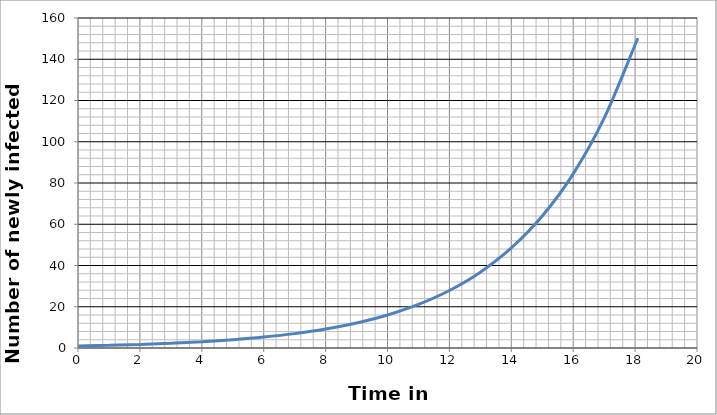
| Category | Series 0 |
|---|---|
| 0.0 | 1 |
| 1.0 | 1.32 |
| 2.0 | 1.741 |
| 3.0 | 2.297 |
| 4.0 | 3.031 |
| 5.0 | 4 |
| 6.0 | 5.278 |
| 7.0 | 6.964 |
| 8.0 | 9.19 |
| 9.0 | 12.126 |
| 10.0 | 16 |
| 11.0 | 21.112 |
| 12.0 | 27.858 |
| 13.0 | 36.758 |
| 14.0 | 48.503 |
| 15.0 | 64 |
| 16.0 | 84.449 |
| 17.0 | 111.43 |
| 18.0 | 147.033 |
| 18.0 | 147.033 |
| 18.0 | 147.033 |
| 18.0 | 147.033 |
| 18.0 | 147.033 |
| 18.0 | 147.033 |
| 18.0 | 147.033 |
| 18.0 | 147.033 |
| 18.0 | 147.033 |
| 18.0 | 147.033 |
| 18.0 | 147.033 |
| 18.0 | 147.033 |
| 18.0 | 147.033 |
| 18.0 | 147.033 |
| 18.0 | 147.033 |
| 18.0 | 147.033 |
| 18.0 | 147.033 |
| 18.0 | 147.033 |
| 18.0 | 147.033 |
| 18.0 | 147.033 |
| 18.0 | 147.033 |
| 18.0 | 147.033 |
| 18.0 | 147.033 |
| 18.0 | 147.033 |
| 18.0 | 147.033 |
| 18.0 | 147.033 |
| 18.0 | 147.033 |
| 18.0 | 147.033 |
| 18.0 | 147.033 |
| 18.0 | 147.033 |
| 18.0 | 147.033 |
| 18.0 | 147.033 |
| 18.0 | 147.033 |
| 18.0 | 147.033 |
| 18.0 | 147.033 |
| 18.0 | 147.033 |
| 18.0 | 147.033 |
| 18.0 | 147.033 |
| 18.0 | 147.033 |
| 18.0 | 147.033 |
| 18.0 | 147.033 |
| 18.0 | 147.033 |
| 18.0 | 147.033 |
| 18.0 | 147.033 |
| 18.0 | 147.033 |
| 18.0 | 147.033 |
| 18.0 | 147.033 |
| 18.0 | 147.033 |
| 18.0 | 147.033 |
| 18.0 | 147.033 |
| 18.0 | 147.033 |
| 18.0 | 147.033 |
| 18.0 | 147.033 |
| 18.0 | 147.033 |
| 18.0 | 147.033 |
| 18.0 | 147.033 |
| 18.0 | 147.033 |
| 18.0 | 147.033 |
| 18.0 | 147.033 |
| 18.0 | 147.033 |
| 18.0 | 147.033 |
| 18.0 | 147.033 |
| 18.0 | 147.033 |
| 18.0 | 147.033 |
| 18.0 | 147.033 |
| 18.0 | 147.033 |
| 18.0 | 147.033 |
| 18.0 | 147.033 |
| 18.0 | 147.033 |
| 18.0 | 147.033 |
| 18.0 | 147.033 |
| 18.0 | 147.033 |
| 18.0 | 147.033 |
| 18.0 | 147.033 |
| 18.0 | 147.033 |
| 18.0 | 147.033 |
| 18.0 | 147.033 |
| 18.0 | 147.033 |
| 18.0 | 147.033 |
| 18.0 | 147.033 |
| 18.0 | 147.033 |
| 18.0 | 147.033 |
| 18.0 | 147.033 |
| 18.0 | 147.033 |
| 18.0 | 147.033 |
| 18.0 | 147.033 |
| 18.0 | 147.033 |
| 18.0 | 147.033 |
| 18.0 | 147.033 |
| 18.0 | 147.033 |
| 18.0 | 147.033 |
| 18.0 | 147.033 |
| 18.0 | 147.033 |
| 18.0 | 147.033 |
| 18.0 | 147.033 |
| 18.0 | 147.033 |
| 18.0 | 147.033 |
| 18.0 | 147.033 |
| 18.0 | 147.033 |
| 18.0 | 147.033 |
| 18.0 | 147.033 |
| 18.0 | 147.033 |
| 18.0 | 147.033 |
| 18.0 | 147.033 |
| 18.0 | 147.033 |
| 18.0 | 147.033 |
| 18.0 | 147.033 |
| 18.0 | 147.033 |
| 18.0 | 147.033 |
| 18.0 | 147.033 |
| 18.0 | 147.033 |
| 18.0 | 147.033 |
| 18.0 | 147.033 |
| 18.0 | 147.033 |
| 18.0 | 147.033 |
| 18.0 | 147.033 |
| 18.0 | 147.033 |
| 18.0 | 147.033 |
| 18.0 | 147.033 |
| 18.0 | 147.033 |
| 18.0 | 147.033 |
| 18.0 | 147.033 |
| 18.0 | 147.033 |
| 18.0 | 147.033 |
| 18.0 | 147.033 |
| 18.0 | 147.033 |
| 18.0 | 147.033 |
| 18.0 | 147.033 |
| 18.0 | 147.033 |
| 18.0 | 147.033 |
| 18.0 | 147.033 |
| 18.0 | 147.033 |
| 18.0 | 147.033 |
| 18.0 | 147.033 |
| 18.0 | 147.033 |
| 18.0 | 147.033 |
| 18.0 | 147.033 |
| 18.0 | 147.033 |
| 18.0 | 147.033 |
| 18.0 | 147.033 |
| 18.0 | 147.033 |
| 18.0 | 147.033 |
| 18.0 | 147.033 |
| 18.0 | 147.033 |
| 18.0 | 147.033 |
| 18.0 | 147.033 |
| 18.0 | 147.033 |
| 18.0 | 147.033 |
| 18.0 | 147.033 |
| 18.0 | 147.033 |
| 18.0 | 147.033 |
| 18.0 | 147.033 |
| 18.0 | 147.033 |
| 18.0 | 147.033 |
| 18.0 | 147.033 |
| 18.0 | 147.033 |
| 18.0 | 147.033 |
| 18.0 | 147.033 |
| 18.0 | 147.033 |
| 18.0 | 147.033 |
| 18.0 | 147.033 |
| 18.0 | 147.033 |
| 18.0 | 147.033 |
| 18.0 | 147.033 |
| 18.0 | 147.033 |
| 18.0 | 147.033 |
| 18.0 | 147.033 |
| 18.0 | 147.033 |
| 18.0 | 147.033 |
| 18.0 | 147.033 |
| 18.0 | 147.033 |
| 18.0 | 147.033 |
| 18.0 | 147.033 |
| 18.0 | 147.033 |
| 18.0 | 147.033 |
| 18.0 | 147.033 |
| 18.0 | 147.033 |
| 18.0 | 147.033 |
| 18.0 | 147.033 |
| 18.0 | 147.033 |
| 18.0 | 147.033 |
| 18.0 | 147.033 |
| 18.0 | 147.033 |
| 18.0 | 147.033 |
| 18.0 | 147.033 |
| 18.0 | 147.033 |
| 18.0 | 147.033 |
| 18.0 | 147.033 |
| 18.0 | 147.033 |
| 18.0 | 147.033 |
| 18.0 | 147.033 |
| 18.0 | 147.033 |
| 18.0 | 147.033 |
| 18.0 | 147.033 |
| 18.0 | 147.033 |
| 18.0 | 147.033 |
| 18.0 | 147.033 |
| 18.0 | 147.033 |
| 18.0 | 147.033 |
| 18.0 | 147.033 |
| 18.0 | 147.033 |
| 18.0 | 147.033 |
| 18.0 | 147.033 |
| 18.0 | 147.033 |
| 18.0 | 147.033 |
| 18.0 | 147.033 |
| 18.0 | 147.033 |
| 18.0 | 147.033 |
| 18.0 | 147.033 |
| 18.0 | 147.033 |
| 18.0 | 147.033 |
| 18.0 | 147.033 |
| 18.0 | 147.033 |
| 18.0 | 147.033 |
| 18.0 | 147.033 |
| 18.0 | 147.033 |
| 18.0 | 147.033 |
| 18.0 | 147.033 |
| 18.0 | 147.033 |
| 18.0 | 147.033 |
| 18.0 | 147.033 |
| 18.0 | 147.033 |
| 18.0 | 147.033 |
| 18.0 | 147.033 |
| 18.0 | 147.033 |
| 18.0 | 147.033 |
| 18.0 | 147.033 |
| 18.0 | 147.033 |
| 18.0 | 147.033 |
| 18.0 | 147.033 |
| 18.0 | 147.033 |
| 18.0 | 147.033 |
| 18.0 | 147.033 |
| 18.0 | 147.033 |
| 18.0 | 147.033 |
| 18.0 | 147.033 |
| 18.0 | 147.033 |
| 18.0 | 147.033 |
| 18.0 | 147.033 |
| 18.0 | 147.033 |
| 18.0 | 147.033 |
| 18.0 | 147.033 |
| 18.0 | 147.033 |
| 18.0 | 147.033 |
| 18.0 | 147.033 |
| 18.0 | 147.033 |
| 18.0 | 147.033 |
| 18.0 | 147.033 |
| 18.0 | 147.033 |
| 18.0 | 147.033 |
| 18.0 | 147.033 |
| 18.0 | 147.033 |
| 18.0 | 147.033 |
| 18.0 | 147.033 |
| 18.0 | 147.033 |
| 18.0 | 147.033 |
| 18.0 | 147.033 |
| 18.0 | 147.033 |
| 18.0 | 147.033 |
| 18.0 | 147.033 |
| 18.0 | 147.033 |
| 18.0 | 147.033 |
| 18.0 | 147.033 |
| 18.0 | 147.033 |
| 18.0 | 147.033 |
| 18.0 | 147.033 |
| 18.0 | 147.033 |
| 18.0 | 147.033 |
| 18.0 | 147.033 |
| 18.0 | 147.033 |
| 18.0 | 147.033 |
| 18.0 | 147.033 |
| 18.0 | 147.033 |
| 18.0 | 147.033 |
| 18.0 | 147.033 |
| 18.0 | 147.033 |
| 18.0 | 147.033 |
| 18.0 | 147.033 |
| 18.0 | 147.033 |
| 18.0 | 147.033 |
| 18.0 | 147.033 |
| 18.0 | 147.033 |
| 18.0 | 147.033 |
| 18.0 | 147.033 |
| 18.0 | 147.033 |
| 18.0 | 147.033 |
| 18.0 | 147.033 |
| 18.0 | 147.033 |
| 18.0 | 147.033 |
| 18.0 | 147.033 |
| 18.0 | 147.033 |
| 18.0 | 147.033 |
| 18.0 | 147.033 |
| 18.0 | 147.033 |
| 18.0 | 147.033 |
| 18.0 | 147.033 |
| 18.0 | 147.033 |
| 18.0 | 147.033 |
| 18.0 | 147.033 |
| 18.0 | 147.033 |
| 18.0 | 147.033 |
| 18.0 | 147.033 |
| 18.0 | 147.033 |
| 18.0 | 147.033 |
| 18.0 | 147.033 |
| 18.0 | 147.033 |
| 18.0 | 147.033 |
| 18.0 | 147.033 |
| 18.0 | 147.033 |
| 18.0 | 147.033 |
| 18.0 | 147.033 |
| 18.0 | 147.033 |
| 18.0 | 147.033 |
| 18.0 | 147.033 |
| 18.0 | 147.033 |
| 18.0 | 147.033 |
| 18.0 | 147.033 |
| 18.0 | 147.033 |
| 18.0 | 147.033 |
| 18.0 | 147.033 |
| 18.0 | 147.033 |
| 18.0 | 147.033 |
| 18.0 | 147.033 |
| 18.0 | 147.033 |
| 18.0 | 147.033 |
| 18.0 | 147.033 |
| 18.0 | 147.033 |
| 18.0 | 147.033 |
| 18.0 | 147.033 |
| 18.0 | 147.033 |
| 18.0 | 147.033 |
| 18.0 | 147.033 |
| 18.0 | 147.033 |
| 18.0 | 147.033 |
| 18.0 | 147.033 |
| 18.0 | 147.033 |
| 18.0 | 147.033 |
| 18.0 | 147.033 |
| 18.0 | 147.033 |
| 18.0 | 147.033 |
| 18.0 | 147.033 |
| 18.0 | 147.033 |
| 18.0 | 147.033 |
| 18.0 | 147.033 |
| 18.0 | 147.033 |
| 18.0 | 147.033 |
| 18.0 | 147.033 |
| 18.0 | 147.033 |
| 18.0 | 147.033 |
| 18.0 | 147.033 |
| 18.0 | 147.033 |
| 18.0 | 147.033 |
| 18.0 | 147.033 |
| 18.0 | 147.033 |
| 18.0 | 147.033 |
| 18.0 | 147.033 |
| 18.0 | 147.033 |
| 18.0 | 147.033 |
| 18.0 | 147.033 |
| 18.0 | 147.033 |
| 18.0 | 147.033 |
| 18.0 | 147.033 |
| 18.0 | 147.033 |
| 18.0 | 147.033 |
| 18.0 | 147.033 |
| 18.0 | 147.033 |
| 18.0 | 147.033 |
| 18.0 | 147.033 |
| 18.0 | 147.033 |
| 18.0 | 147.033 |
| 18.0 | 147.033 |
| 18.0 | 147.033 |
| 18.0 | 147.033 |
| 18.0 | 147.033 |
| 18.0 | 147.033 |
| 18.0 | 147.033 |
| 18.0 | 147.033 |
| 18.0 | 147.033 |
| 18.0 | 147.033 |
| 18.0 | 147.033 |
| 18.0 | 147.033 |
| 18.0 | 147.033 |
| 18.0 | 147.033 |
| 18.0 | 147.033 |
| 18.0 | 147.033 |
| 18.0 | 147.033 |
| 18.0 | 147.033 |
| 18.0 | 147.033 |
| 18.0 | 147.033 |
| 18.0 | 147.033 |
| 18.0 | 147.033 |
| 18.0 | 147.033 |
| 18.0 | 147.033 |
| 18.0 | 147.033 |
| 18.0 | 147.033 |
| 18.0 | 147.033 |
| 18.0 | 147.033 |
| 18.0 | 147.033 |
| 18.0 | 147.033 |
| 18.0 | 147.033 |
| 18.0 | 147.033 |
| 18.0 | 147.033 |
| 18.0 | 147.033 |
| 18.0 | 147.033 |
| 18.0 | 147.033 |
| 18.0 | 147.033 |
| 18.0 | 147.033 |
| 18.0 | 147.033 |
| 18.0 | 147.033 |
| 18.0 | 147.033 |
| 18.0 | 147.033 |
| 18.0 | 147.033 |
| 18.0 | 147.033 |
| 18.0 | 147.033 |
| 18.0 | 147.033 |
| 18.0 | 147.033 |
| 18.0 | 147.033 |
| 18.0 | 147.033 |
| 18.0 | 147.033 |
| 18.0 | 147.033 |
| 18.0 | 147.033 |
| 18.0 | 147.033 |
| 18.0 | 147.033 |
| 18.0 | 147.033 |
| 18.0 | 147.033 |
| 18.0 | 147.033 |
| 18.0 | 147.033 |
| 18.0 | 147.033 |
| 18.0 | 147.033 |
| 18.0 | 147.033 |
| 18.0 | 147.033 |
| 18.0 | 147.033 |
| 18.0 | 147.033 |
| 18.0 | 147.033 |
| 18.0 | 147.033 |
| 18.0 | 147.033 |
| 18.0 | 147.033 |
| 18.0 | 147.033 |
| 18.0 | 147.033 |
| 18.0 | 147.033 |
| 18.0 | 147.033 |
| 18.0 | 147.033 |
| 18.0 | 147.033 |
| 18.0 | 147.033 |
| 18.0 | 147.033 |
| 18.0 | 147.033 |
| 18.0 | 147.033 |
| 18.0 | 147.033 |
| 18.0 | 147.033 |
| 18.0 | 147.033 |
| 18.0 | 147.033 |
| 18.0 | 147.033 |
| 18.0 | 147.033 |
| 18.0 | 147.033 |
| 18.0 | 147.033 |
| 18.0 | 147.033 |
| 18.0 | 147.033 |
| 18.0 | 147.033 |
| 18.0 | 147.033 |
| 18.0 | 147.033 |
| 18.0 | 147.033 |
| 18.0 | 147.033 |
| 18.0 | 147.033 |
| 18.0 | 147.033 |
| 18.0 | 147.033 |
| 18.0 | 147.033 |
| 18.0 | 147.033 |
| 18.0 | 147.033 |
| 18.0 | 147.033 |
| 18.0 | 147.033 |
| 18.0 | 147.033 |
| 18.0 | 147.033 |
| 18.0 | 147.033 |
| 18.0 | 147.033 |
| 18.0 | 147.033 |
| 18.0 | 147.033 |
| 18.0 | 147.033 |
| 18.0 | 147.033 |
| 18.0 | 147.033 |
| 18.0 | 147.033 |
| 18.0 | 147.033 |
| 18.0 | 147.033 |
| 18.0 | 147.033 |
| 18.0 | 147.033 |
| 18.0 | 147.033 |
| 18.0 | 147.033 |
| 18.0 | 147.033 |
| 18.0 | 147.033 |
| 18.0 | 147.033 |
| 18.0 | 147.033 |
| 18.0 | 147.033 |
| 18.0 | 147.033 |
| 18.0 | 147.033 |
| 18.0 | 147.033 |
| 18.0 | 147.033 |
| 18.0 | 147.033 |
| 18.0 | 147.033 |
| 18.0 | 147.033 |
| 18.0 | 147.033 |
| 18.0 | 147.033 |
| 18.0 | 147.033 |
| 18.0 | 147.033 |
| 18.0 | 147.033 |
| 18.0 | 147.033 |
| 18.0 | 147.033 |
| 18.0 | 147.033 |
| 18.0 | 147.033 |
| 18.0 | 147.033 |
| 18.0 | 147.033 |
| 18.0 | 147.033 |
| 18.0 | 147.033 |
| 18.0 | 147.033 |
| 18.0 | 147.033 |
| 18.0 | 147.033 |
| 18.0 | 147.033 |
| 18.0 | 147.033 |
| 18.0 | 147.033 |
| 18.0 | 147.033 |
| 18.0 | 147.033 |
| 18.0 | 147.033 |
| 18.0 | 147.033 |
| 18.0 | 147.033 |
| 18.0 | 147.033 |
| 18.0 | 147.033 |
| 18.0 | 147.033 |
| 18.0 | 147.033 |
| 18.0 | 147.033 |
| 18.0 | 147.033 |
| 18.0 | 147.033 |
| 18.0 | 147.033 |
| 18.0 | 147.033 |
| 18.0 | 147.033 |
| 18.0 | 147.033 |
| 18.0 | 147.033 |
| 18.0 | 147.033 |
| 18.0 | 147.033 |
| 18.0 | 147.033 |
| 18.0 | 147.033 |
| 18.0 | 147.033 |
| 18.0 | 147.033 |
| 18.0 | 147.033 |
| 18.0 | 147.033 |
| 18.0 | 147.033 |
| 18.0 | 147.033 |
| 18.0 | 147.033 |
| 18.0 | 147.033 |
| 18.0 | 147.033 |
| 18.0 | 147.033 |
| 18.0 | 147.033 |
| 18.0 | 147.033 |
| 18.0 | 147.033 |
| 18.0 | 147.033 |
| 18.0 | 147.033 |
| 18.0 | 147.033 |
| 18.0 | 147.033 |
| 18.0 | 147.033 |
| 18.0 | 147.033 |
| 18.0 | 147.033 |
| 18.0 | 147.033 |
| 18.0 | 147.033 |
| 18.0 | 147.033 |
| 18.0 | 147.033 |
| 18.0 | 147.033 |
| 18.0 | 147.033 |
| 18.0 | 147.033 |
| 18.0 | 147.033 |
| 18.0 | 147.033 |
| 18.0 | 147.033 |
| 18.0 | 147.033 |
| 18.0 | 147.033 |
| 18.0 | 147.033 |
| 18.0 | 147.033 |
| 18.0 | 147.033 |
| 18.0 | 147.033 |
| 18.0 | 147.033 |
| 18.0 | 147.033 |
| 18.0 | 147.033 |
| 18.0 | 147.033 |
| 18.0 | 147.033 |
| 18.0 | 147.033 |
| 18.0 | 147.033 |
| 18.0 | 147.033 |
| 18.0 | 147.033 |
| 18.0 | 147.033 |
| 18.0 | 147.033 |
| 18.0 | 147.033 |
| 18.0 | 147.033 |
| 18.0 | 147.033 |
| 18.0 | 147.033 |
| 18.0 | 147.033 |
| 18.0 | 147.033 |
| 18.0 | 147.033 |
| 18.0 | 147.033 |
| 18.0 | 147.033 |
| 18.0 | 147.033 |
| 18.0 | 147.033 |
| 18.0 | 147.033 |
| 18.0 | 147.033 |
| 18.0 | 147.033 |
| 18.0 | 147.033 |
| 18.0 | 147.033 |
| 18.0 | 147.033 |
| 18.0 | 147.033 |
| 18.0 | 147.033 |
| 18.0 | 147.033 |
| 18.0 | 147.033 |
| 18.0 | 147.033 |
| 18.0 | 147.033 |
| 18.0 | 147.033 |
| 18.0 | 147.033 |
| 18.0 | 147.033 |
| 18.0 | 147.033 |
| 18.0 | 147.033 |
| 18.0 | 147.033 |
| 18.0 | 147.033 |
| 18.0 | 147.033 |
| 18.0 | 147.033 |
| 18.0 | 147.033 |
| 18.0 | 147.033 |
| 18.0 | 147.033 |
| 18.0 | 147.033 |
| 18.0 | 147.033 |
| 18.0 | 147.033 |
| 18.0 | 147.033 |
| 18.0 | 147.033 |
| 18.0 | 147.033 |
| 18.0 | 147.033 |
| 18.0 | 147.033 |
| 18.0 | 147.033 |
| 18.0 | 147.033 |
| 18.0 | 147.033 |
| 18.0 | 147.033 |
| 18.0 | 147.033 |
| 18.0 | 147.033 |
| 18.0 | 147.033 |
| 18.0 | 147.033 |
| 18.0 | 147.033 |
| 18.0 | 147.033 |
| 18.0 | 147.033 |
| 18.0 | 147.033 |
| 18.0 | 147.033 |
| 18.0 | 147.033 |
| 18.0 | 147.033 |
| 18.0 | 147.033 |
| 18.0 | 147.033 |
| 18.0 | 147.033 |
| 18.0 | 147.033 |
| 18.0 | 147.033 |
| 18.0 | 147.033 |
| 18.0 | 147.033 |
| 18.0 | 147.033 |
| 18.0 | 147.033 |
| 18.0 | 147.033 |
| 18.0 | 147.033 |
| 18.0 | 147.033 |
| 18.0 | 147.033 |
| 18.0 | 147.033 |
| 18.0 | 147.033 |
| 18.0 | 147.033 |
| 18.0 | 147.033 |
| 18.0 | 147.033 |
| 18.0 | 147.033 |
| 18.0 | 147.033 |
| 18.0 | 147.033 |
| 18.0 | 147.033 |
| 18.0 | 147.033 |
| 18.0 | 147.033 |
| 18.0 | 147.033 |
| 18.0 | 147.033 |
| 18.0 | 147.033 |
| 18.0 | 147.033 |
| 18.0 | 147.033 |
| 18.0 | 147.033 |
| 18.0 | 147.033 |
| 18.0 | 147.033 |
| 18.0 | 147.033 |
| 18.0 | 147.033 |
| 18.0 | 147.033 |
| 18.0 | 147.033 |
| 18.0 | 147.033 |
| 18.0 | 147.033 |
| 18.0 | 147.033 |
| 18.0 | 147.033 |
| 18.0 | 147.033 |
| 18.0 | 147.033 |
| 18.0 | 147.033 |
| 18.0 | 147.033 |
| 18.0 | 147.033 |
| 18.0 | 147.033 |
| 18.0 | 147.033 |
| 18.0 | 147.033 |
| 18.0 | 147.033 |
| 18.0 | 147.033 |
| 18.0 | 147.033 |
| 18.0 | 147.033 |
| 18.0 | 147.033 |
| 18.0 | 147.033 |
| 18.0 | 147.033 |
| 18.0 | 147.033 |
| 18.0 | 147.033 |
| 18.0 | 147.033 |
| 18.0 | 147.033 |
| 18.0 | 147.033 |
| 18.0 | 147.033 |
| 18.0 | 147.033 |
| 18.0 | 147.033 |
| 18.0 | 147.033 |
| 18.0 | 147.033 |
| 18.0 | 147.033 |
| 18.0 | 147.033 |
| 18.0 | 147.033 |
| 18.0 | 147.033 |
| 18.0 | 147.033 |
| 18.0 | 147.033 |
| 18.0 | 147.033 |
| 18.0 | 147.033 |
| 18.0 | 147.033 |
| 18.0 | 147.033 |
| 18.0 | 147.033 |
| 18.0 | 147.033 |
| 18.0 | 147.033 |
| 18.0 | 147.033 |
| 18.0 | 147.033 |
| 18.0 | 147.033 |
| 18.0 | 147.033 |
| 18.0 | 147.033 |
| 18.0 | 147.033 |
| 18.0 | 147.033 |
| 18.0 | 147.033 |
| 18.0 | 147.033 |
| 18.0 | 147.033 |
| 18.0 | 147.033 |
| 18.0 | 147.033 |
| 18.0 | 147.033 |
| 18.0 | 147.033 |
| 18.0 | 147.033 |
| 18.0 | 147.033 |
| 18.0 | 147.033 |
| 18.0 | 147.033 |
| 18.0 | 147.033 |
| 18.0 | 147.033 |
| 18.0 | 147.033 |
| 18.0 | 147.033 |
| 18.0 | 147.033 |
| 18.0 | 147.033 |
| 18.0 | 147.033 |
| 18.0 | 147.033 |
| 18.0 | 147.033 |
| 18.0 | 147.033 |
| 18.0 | 147.033 |
| 18.0 | 147.033 |
| 18.0 | 147.033 |
| 18.0 | 147.033 |
| 18.0 | 147.033 |
| 18.0 | 147.033 |
| 18.0 | 147.033 |
| 18.0 | 147.033 |
| 18.0 | 147.033 |
| 18.0 | 147.033 |
| 18.0 | 147.033 |
| 18.0 | 147.033 |
| 18.0 | 147.033 |
| 18.0 | 147.033 |
| 18.0 | 147.033 |
| 18.0 | 147.033 |
| 18.0 | 147.033 |
| 18.0 | 147.033 |
| 18.0 | 147.033 |
| 18.0 | 147.033 |
| 18.0 | 147.033 |
| 18.0 | 147.033 |
| 18.0 | 147.033 |
| 18.0 | 147.033 |
| 18.0 | 147.033 |
| 18.0 | 147.033 |
| 18.0 | 147.033 |
| 18.0 | 147.033 |
| 18.0 | 147.033 |
| 18.0 | 147.033 |
| 18.0 | 147.033 |
| 18.0 | 147.033 |
| 18.0 | 147.033 |
| 18.0 | 147.033 |
| 18.0 | 147.033 |
| 18.0 | 147.033 |
| 18.0 | 147.033 |
| 18.0 | 147.033 |
| 18.0 | 147.033 |
| 18.0 | 147.033 |
| 18.0 | 147.033 |
| 18.0 | 147.033 |
| 18.0 | 147.033 |
| 18.0 | 147.033 |
| 18.0 | 147.033 |
| 18.0 | 147.033 |
| 18.0 | 147.033 |
| 18.0 | 147.033 |
| 18.0 | 147.033 |
| 18.0 | 147.033 |
| 18.0 | 147.033 |
| 18.0 | 147.033 |
| 18.0 | 147.033 |
| 18.0 | 147.033 |
| 18.0 | 147.033 |
| 18.0 | 147.033 |
| 18.0 | 147.033 |
| 18.0 | 147.033 |
| 18.0 | 147.033 |
| 18.0 | 147.033 |
| 18.0 | 147.033 |
| 18.0 | 147.033 |
| 18.0 | 147.033 |
| 18.0 | 147.033 |
| 18.0 | 147.033 |
| 18.0 | 147.033 |
| 18.0 | 147.033 |
| 18.0 | 147.033 |
| 18.0 | 147.033 |
| 18.0 | 147.033 |
| 18.0 | 147.033 |
| 18.0 | 147.033 |
| 18.0 | 147.033 |
| 18.0 | 147.033 |
| 18.0 | 147.033 |
| 18.0 | 147.033 |
| 18.0 | 147.033 |
| 18.0 | 147.033 |
| 18.0 | 147.033 |
| 18.0 | 147.033 |
| 18.0 | 147.033 |
| 18.0 | 147.033 |
| 18.0 | 147.033 |
| 18.0 | 147.033 |
| 18.0 | 147.033 |
| 18.0 | 147.033 |
| 18.0 | 147.033 |
| 18.0 | 147.033 |
| 18.0 | 147.033 |
| 18.0 | 147.033 |
| 18.0 | 147.033 |
| 18.0 | 147.033 |
| 18.0 | 147.033 |
| 18.0 | 147.033 |
| 18.0 | 147.033 |
| 18.0 | 147.033 |
| 18.0 | 147.033 |
| 18.0 | 147.033 |
| 18.0 | 147.033 |
| 18.0 | 147.033 |
| 18.0 | 147.033 |
| 18.0 | 147.033 |
| 18.0 | 147.033 |
| 18.0 | 147.033 |
| 18.0 | 147.033 |
| 18.0 | 147.033 |
| 18.0 | 147.033 |
| 18.0 | 147.033 |
| 18.0 | 147.033 |
| 18.0 | 147.033 |
| 18.0 | 147.033 |
| 18.0 | 147.033 |
| 18.0 | 147.033 |
| 18.0 | 147.033 |
| 18.0 | 147.033 |
| 18.0 | 147.033 |
| 18.0 | 147.033 |
| 18.0 | 147.033 |
| 18.0 | 147.033 |
| 18.0 | 147.033 |
| 18.0 | 147.033 |
| 18.0 | 147.033 |
| 18.0 | 147.033 |
| 18.0 | 147.033 |
| 18.0 | 147.033 |
| 18.0 | 147.033 |
| 18.0 | 147.033 |
| 18.0 | 147.033 |
| 18.0 | 147.033 |
| 18.0 | 147.033 |
| 18.0 | 147.033 |
| 18.0 | 147.033 |
| 18.0 | 147.033 |
| 18.0 | 147.033 |
| 18.0 | 147.033 |
| 18.0 | 147.033 |
| 18.0 | 147.033 |
| 18.0 | 147.033 |
| 18.0 | 147.033 |
| 18.0 | 147.033 |
| 18.0 | 147.033 |
| 18.0 | 147.033 |
| 18.0 | 147.033 |
| 18.0 | 147.033 |
| 18.0 | 147.033 |
| 18.0 | 147.033 |
| 18.0 | 147.033 |
| 18.0 | 147.033 |
| 18.0 | 147.033 |
| 18.0 | 147.033 |
| 18.0 | 147.033 |
| 18.0 | 147.033 |
| 18.0 | 147.033 |
| 18.0 | 147.033 |
| 18.0 | 147.033 |
| 18.0 | 147.033 |
| 18.0 | 147.033 |
| 18.0 | 147.033 |
| 18.0 | 147.033 |
| 18.0 | 147.033 |
| 18.0 | 147.033 |
| 18.0 | 147.033 |
| 18.0 | 147.033 |
| 18.0 | 147.033 |
| 18.0 | 147.033 |
| 18.0 | 147.033 |
| 18.0 | 147.033 |
| 18.0 | 147.033 |
| 18.0 | 147.033 |
| 18.0 | 147.033 |
| 18.0 | 147.033 |
| 18.0 | 147.033 |
| 18.0 | 147.033 |
| 18.0 | 147.033 |
| 18.0 | 147.033 |
| 18.0 | 147.033 |
| 18.0 | 147.033 |
| 18.0 | 147.033 |
| 18.0 | 147.033 |
| 18.0 | 147.033 |
| 18.0 | 147.033 |
| 18.0 | 147.033 |
| 18.0 | 147.033 |
| 18.0 | 147.033 |
| 18.0 | 147.033 |
| 18.0 | 147.033 |
| 18.0 | 147.033 |
| 18.0 | 147.033 |
| 18.0 | 147.033 |
| 18.0 | 147.033 |
| 18.0 | 147.033 |
| 18.0 | 147.033 |
| 18.0 | 147.033 |
| 18.0 | 147.033 |
| 18.0 | 147.033 |
| 18.0 | 147.033 |
| 18.0 | 147.033 |
| 18.0 | 147.033 |
| 18.0 | 147.033 |
| 18.0 | 147.033 |
| 18.0 | 147.033 |
| 18.0 | 147.033 |
| 18.0 | 147.033 |
| 18.0 | 147.033 |
| 18.0 | 147.033 |
| 18.0 | 147.033 |
| 18.0 | 147.033 |
| 18.0 | 147.033 |
| 18.0 | 147.033 |
| 18.0 | 147.033 |
| 18.0 | 147.033 |
| 18.0 | 147.033 |
| 18.0 | 147.033 |
| 18.0 | 147.033 |
| 18.0 | 147.033 |
| 18.0 | 147.033 |
| 18.0 | 147.033 |
| 18.0 | 147.033 |
| 18.0 | 147.033 |
| 18.0 | 147.033 |
| 18.0 | 147.033 |
| 18.0 | 147.033 |
| 18.0 | 147.033 |
| 18.0 | 147.033 |
| 18.0 | 147.033 |
| 18.0 | 147.033 |
| 18.0 | 147.033 |
| 18.0 | 147.033 |
| 18.0 | 147.033 |
| 18.0 | 147.033 |
| 18.0 | 147.033 |
| 18.0 | 147.033 |
| 18.0 | 147.033 |
| 18.0 | 147.033 |
| 18.0 | 147.033 |
| 18.0 | 147.033 |
| 18.0 | 147.033 |
| 18.0 | 147.033 |
| 18.0 | 147.033 |
| 18.0 | 147.033 |
| 18.0 | 147.033 |
| 18.0 | 147.033 |
| 18.0 | 147.033 |
| 18.0 | 147.033 |
| 18.0 | 147.033 |
| 18.0 | 147.033 |
| 18.0 | 147.033 |
| 18.0 | 147.033 |
| 18.0 | 147.033 |
| 18.0 | 147.033 |
| 18.0 | 147.033 |
| 18.0 | 147.033 |
| 18.0 | 147.033 |
| 18.0 | 147.033 |
| 18.0 | 147.033 |
| 18.0 | 147.033 |
| 18.0 | 147.033 |
| 18.0 | 147.033 |
| 18.0 | 147.033 |
| 18.0 | 147.033 |
| 18.0 | 147.033 |
| 18.0 | 147.033 |
| 18.0 | 147.033 |
| 18.0 | 147.033 |
| 18.0 | 147.033 |
| 18.0 | 147.033 |
| 18.0 | 147.033 |
| 18.0 | 147.033 |
| 18.0 | 147.033 |
| 18.0 | 147.033 |
| 18.0 | 147.033 |
| 18.0 | 147.033 |
| 18.0 | 147.033 |
| 18.0 | 147.033 |
| 18.0 | 147.033 |
| 18.0 | 147.033 |
| 18.0 | 147.033 |
| 18.0 | 147.033 |
| 18.0 | 147.033 |
| 18.0 | 147.033 |
| 18.0 | 147.033 |
| 18.0 | 147.033 |
| 18.0 | 147.033 |
| 18.0 | 147.033 |
| 18.0 | 147.033 |
| 18.0 | 147.033 |
| 18.0 | 147.033 |
| 18.0 | 147.033 |
| 18.0 | 147.033 |
| 18.0 | 147.033 |
| 18.0 | 147.033 |
| 18.0 | 147.033 |
| 18.0 | 147.033 |
| 18.0 | 147.033 |
| 18.0 | 147.033 |
| 18.0 | 147.033 |
| 18.0 | 147.033 |
| 18.0 | 147.033 |
| 18.0 | 147.033 |
| 18.0 | 147.033 |
| 18.0 | 147.033 |
| 18.0 | 147.033 |
| 18.0 | 147.033 |
| 18.0 | 147.033 |
| 18.0 | 147.033 |
| 18.0 | 147.033 |
| 18.0 | 147.033 |
| 18.0 | 147.033 |
| 18.0 | 147.033 |
| 18.0 | 147.033 |
| 18.0 | 147.033 |
| 18.0 | 147.033 |
| 18.0 | 147.033 |
| 18.0 | 147.033 |
| 18.0 | 147.033 |
| 18.0 | 147.033 |
| 18.0 | 147.033 |
| 18.0 | 147.033 |
| 18.0 | 147.033 |
| 18.0 | 147.033 |
| 18.0 | 147.033 |
| 18.0 | 147.033 |
| 18.0 | 147.033 |
| 18.0 | 147.033 |
| 18.0 | 147.033 |
| 18.0 | 147.033 |
| 18.0 | 147.033 |
| 18.0 | 147.033 |
| 18.0 | 147.033 |
| 18.0 | 147.033 |
| 18.0 | 147.033 |
| 18.0 | 147.033 |
| 18.0 | 147.033 |
| 18.0 | 147.033 |
| 18.0 | 147.033 |
| 18.0 | 147.033 |
| 18.0 | 147.033 |
| 18.0 | 147.033 |
| 18.0 | 147.033 |
| 18.0 | 147.033 |
| 18.0 | 147.033 |
| 18.0 | 147.033 |
| 18.0 | 147.033 |
| 18.0 | 147.033 |
| 18.0 | 147.033 |
| 18.0 | 147.033 |
| 18.0 | 147.033 |
| 18.0 | 147.033 |
| 18.0 | 147.033 |
| 18.0 | 147.033 |
| 18.0 | 147.033 |
| 18.0 | 147.033 |
| 18.0 | 147.033 |
| 18.0 | 147.033 |
| 18.0 | 147.033 |
| 18.0 | 147.033 |
| 18.0 | 147.033 |
| 18.0 | 147.033 |
| 18.0 | 147.033 |
| 18.0 | 147.033 |
| 18.0 | 147.033 |
| 18.0 | 147.033 |
| 18.0 | 147.033 |
| 18.0 | 147.033 |
| 18.0 | 147.033 |
| 18.0 | 147.033 |
| 18.0 | 147.033 |
| 18.0 | 147.033 |
| 18.0 | 147.033 |
| 18.0 | 147.033 |
| 18.0 | 147.033 |
| 18.0 | 147.033 |
| 18.0 | 147.033 |
| 18.0 | 147.033 |
| 18.0 | 147.033 |
| 18.0 | 147.033 |
| 18.0 | 147.033 |
| 18.0 | 147.033 |
| 18.0 | 147.033 |
| 18.0 | 147.033 |
| 18.0 | 147.033 |
| 18.0 | 147.033 |
| 18.0 | 147.033 |
| 18.0 | 147.033 |
| 18.0 | 147.033 |
| 18.0 | 147.033 |
| 18.0 | 147.033 |
| 18.0 | 147.033 |
| 18.0 | 147.033 |
| 18.0 | 147.033 |
| 18.0 | 147.033 |
| 18.0 | 147.033 |
| 18.0 | 147.033 |
| 18.0 | 147.033 |
| 18.0 | 147.033 |
| 18.0 | 147.033 |
| 18.0 | 147.033 |
| 18.0 | 147.033 |
| 18.0 | 147.033 |
| 18.0 | 147.033 |
| 18.0 | 147.033 |
| 18.0 | 147.033 |
| 18.0 | 147.033 |
| 18.0 | 147.033 |
| 18.0 | 147.033 |
| 18.0 | 147.033 |
| 18.0 | 147.033 |
| 18.0 | 147.033 |
| 18.0 | 147.033 |
| 18.0 | 147.033 |
| 18.0 | 147.033 |
| 18.0 | 147.033 |
| 18.0 | 147.033 |
| 18.0 | 147.033 |
| 18.0 | 147.033 |
| 18.0 | 147.033 |
| 18.0 | 147.033 |
| 18.0 | 147.033 |
| 18.0 | 147.033 |
| 18.0 | 147.033 |
| 18.0 | 147.033 |
| 18.0 | 147.033 |
| 18.0 | 147.033 |
| 18.0 | 147.033 |
| 18.0 | 147.033 |
| 18.0 | 147.033 |
| 18.0 | 147.033 |
| 18.0 | 147.033 |
| 18.0 | 147.033 |
| 18.0 | 147.033 |
| 18.0 | 147.033 |
| 18.0 | 147.033 |
| 18.0 | 147.033 |
| 18.0 | 147.033 |
| 18.0 | 147.033 |
| 18.0 | 147.033 |
| 18.0 | 147.033 |
| 18.0 | 147.033 |
| 18.0 | 147.033 |
| 18.0 | 147.033 |
| 18.0 | 147.033 |
| 18.0 | 147.033 |
| 18.0 | 147.033 |
| 18.0 | 147.033 |
| 18.0 | 147.033 |
| 18.0 | 147.033 |
| 18.0 | 147.033 |
| 18.0 | 147.033 |
| 18.0 | 147.033 |
| 18.0 | 147.033 |
| 18.0 | 147.033 |
| 18.0 | 147.033 |
| 18.0 | 147.033 |
| 18.0 | 147.033 |
| 18.0 | 147.033 |
| 18.0 | 147.033 |
| 18.0 | 147.033 |
| 18.0 | 147.033 |
| 18.0 | 147.033 |
| 18.0 | 147.033 |
| 18.0 | 147.033 |
| 18.0 | 147.033 |
| 18.0 | 147.033 |
| 18.0 | 147.033 |
| 18.0 | 147.033 |
| 18.0 | 147.033 |
| 18.0 | 147.033 |
| 18.0 | 147.033 |
| 18.0 | 147.033 |
| 18.0 | 147.033 |
| 18.0 | 147.033 |
| 18.0 | 147.033 |
| 18.0 | 147.033 |
| 18.0 | 147.033 |
| 18.0 | 147.033 |
| 18.0 | 147.033 |
| 18.0 | 147.033 |
| 18.0 | 147.033 |
| 18.0 | 147.033 |
| 18.0 | 147.033 |
| 18.0 | 147.033 |
| 18.0 | 147.033 |
| 18.0 | 147.033 |
| 18.0 | 147.033 |
| 18.0 | 147.033 |
| 18.0 | 147.033 |
| 18.0 | 147.033 |
| 18.0 | 147.033 |
| 18.0 | 147.033 |
| 18.0 | 147.033 |
| 18.0 | 147.033 |
| 18.0 | 147.033 |
| 18.0 | 147.033 |
| 18.0 | 147.033 |
| 18.0 | 147.033 |
| 18.0 | 147.033 |
| 18.0 | 147.033 |
| 18.0 | 147.033 |
| 18.0 | 147.033 |
| 18.0 | 147.033 |
| 18.0 | 147.033 |
| 18.0 | 147.033 |
| 18.0 | 147.033 |
| 18.0 | 147.033 |
| 18.0 | 147.033 |
| 18.0 | 147.033 |
| 18.0 | 147.033 |
| 18.0 | 147.033 |
| 18.0 | 147.033 |
| 18.0 | 147.033 |
| 18.0 | 147.033 |
| 18.0 | 147.033 |
| 18.0 | 147.033 |
| 18.0 | 147.033 |
| 18.0 | 147.033 |
| 18.0 | 147.033 |
| 18.0 | 147.033 |
| 18.0 | 147.033 |
| 18.0 | 147.033 |
| 18.0 | 147.033 |
| 18.0 | 147.033 |
| 18.0 | 147.033 |
| 18.0 | 147.033 |
| 18.0 | 147.033 |
| 18.0 | 147.033 |
| 18.0 | 147.033 |
| 18.0 | 147.033 |
| 18.0 | 147.033 |
| 18.0 | 147.033 |
| 18.0 | 147.033 |
| 18.0 | 147.033 |
| 18.0 | 147.033 |
| 18.0 | 147.033 |
| 18.0 | 147.033 |
| 18.0 | 147.033 |
| 18.0 | 147.033 |
| 18.0 | 147.033 |
| 18.0 | 147.033 |
| 18.0 | 147.033 |
| 18.0 | 147.033 |
| 18.0 | 147.033 |
| 18.0 | 147.033 |
| 18.0 | 147.033 |
| 18.0 | 147.033 |
| 18.0 | 147.033 |
| 18.0 | 147.033 |
| 18.0 | 147.033 |
| 18.0 | 147.033 |
| 18.0 | 147.033 |
| 18.0 | 147.033 |
| 18.0 | 147.033 |
| 18.0 | 147.033 |
| 18.0 | 147.033 |
| 18.0 | 147.033 |
| 18.0 | 147.033 |
| 18.0 | 147.033 |
| 18.0 | 147.033 |
| 18.0 | 147.033 |
| 18.0 | 147.033 |
| 18.0 | 147.033 |
| 18.0 | 147.033 |
| 18.0 | 147.033 |
| 18.0 | 147.033 |
| 18.0 | 147.033 |
| 18.0 | 147.033 |
| 18.0 | 147.033 |
| 18.0 | 147.033 |
| 18.0 | 147.033 |
| 18.0 | 147.033 |
| 18.0 | 147.033 |
| 18.0 | 147.033 |
| 18.0 | 147.033 |
| 18.0 | 147.033 |
| 18.0 | 147.033 |
| 18.0 | 147.033 |
| 18.0 | 147.033 |
| 18.0 | 147.033 |
| 18.0 | 147.033 |
| 18.0 | 147.033 |
| 18.0 | 147.033 |
| 18.0 | 147.033 |
| 18.0 | 147.033 |
| 18.0 | 147.033 |
| 18.0 | 147.033 |
| 18.0 | 147.033 |
| 18.0 | 147.033 |
| 18.0 | 147.033 |
| 18.0 | 147.033 |
| 18.0 | 147.033 |
| 18.0 | 147.033 |
| 18.0 | 147.033 |
| 18.0 | 147.033 |
| 18.0 | 147.033 |
| 18.0 | 147.033 |
| 18.0 | 147.033 |
| 18.0 | 147.033 |
| 18.0 | 147.033 |
| 18.0 | 147.033 |
| 18.0 | 147.033 |
| 18.0 | 147.033 |
| 18.0 | 147.033 |
| 18.0 | 147.033 |
| 18.0 | 147.033 |
| 18.0 | 147.033 |
| 18.0 | 147.033 |
| 18.0 | 147.033 |
| 18.0 | 147.033 |
| 18.0 | 147.033 |
| 18.0 | 147.033 |
| 18.0 | 147.033 |
| 18.0 | 147.033 |
| 18.0 | 147.033 |
| 18.0 | 147.033 |
| 18.0 | 147.033 |
| 18.0 | 147.033 |
| 18.0 | 147.033 |
| 18.0 | 147.033 |
| 18.0 | 147.033 |
| 18.0 | 147.033 |
| 18.0 | 147.033 |
| 18.0 | 147.033 |
| 18.0 | 147.033 |
| 18.0 | 147.033 |
| 18.0 | 147.033 |
| 18.0 | 147.033 |
| 18.0 | 147.033 |
| 18.0 | 147.033 |
| 18.0 | 147.033 |
| 18.0 | 147.033 |
| 18.0 | 147.033 |
| 18.0 | 147.033 |
| 18.0 | 147.033 |
| 18.0 | 147.033 |
| 18.0 | 147.033 |
| 18.0 | 147.033 |
| 18.0 | 147.033 |
| 18.0 | 147.033 |
| 18.0 | 147.033 |
| 18.0 | 147.033 |
| 18.0 | 147.033 |
| 18.0 | 147.033 |
| 18.0 | 147.033 |
| 18.0 | 147.033 |
| 18.0 | 147.033 |
| 18.0 | 147.033 |
| 18.0 | 147.033 |
| 18.0 | 147.033 |
| 18.0 | 147.033 |
| 18.0 | 147.033 |
| 18.0 | 147.033 |
| 18.0 | 147.033 |
| 18.0 | 147.033 |
| 18.0 | 147.033 |
| 18.0 | 147.033 |
| 18.0 | 147.033 |
| 18.0 | 147.033 |
| 18.0 | 147.033 |
| 18.0 | 147.033 |
| 18.0 | 147.033 |
| 18.0 | 147.033 |
| 18.0 | 147.033 |
| 18.0 | 147.033 |
| 18.0 | 147.033 |
| 18.0 | 147.033 |
| 18.0 | 147.033 |
| 18.0 | 147.033 |
| 18.0 | 147.033 |
| 18.0 | 147.033 |
| 18.0 | 147.033 |
| 18.0 | 147.033 |
| 18.0 | 147.033 |
| 18.0 | 147.033 |
| 18.0 | 147.033 |
| 18.0 | 147.033 |
| 18.0 | 147.033 |
| 18.0 | 147.033 |
| 18.0 | 147.033 |
| 18.0 | 147.033 |
| 18.0 | 147.033 |
| 18.0 | 147.033 |
| 18.0 | 147.033 |
| 18.0 | 147.033 |
| 18.0 | 147.033 |
| 18.0 | 147.033 |
| 18.0 | 147.033 |
| 18.0 | 147.033 |
| 18.0 | 147.033 |
| 18.0 | 147.033 |
| 18.0 | 147.033 |
| 18.0 | 147.033 |
| 18.0 | 147.033 |
| 18.0 | 147.033 |
| 18.0 | 147.033 |
| 18.0 | 147.033 |
| 18.0 | 147.033 |
| 18.0 | 147.033 |
| 18.0 | 147.033 |
| 18.0 | 147.033 |
| 18.0 | 147.033 |
| 18.0 | 147.033 |
| 18.0 | 147.033 |
| 18.0 | 147.033 |
| 18.0 | 147.033 |
| 18.0 | 147.033 |
| 18.0 | 147.033 |
| 18.0 | 147.033 |
| 18.0 | 147.033 |
| 18.0 | 147.033 |
| 18.0 | 147.033 |
| 18.0 | 147.033 |
| 18.0 | 147.033 |
| 18.0 | 147.033 |
| 18.0 | 147.033 |
| 18.0 | 147.033 |
| 18.0 | 147.033 |
| 18.0 | 147.033 |
| 18.0 | 147.033 |
| 18.0 | 147.033 |
| 18.0 | 147.033 |
| 18.0 | 147.033 |
| 18.0 | 147.033 |
| 18.0 | 147.033 |
| 18.0 | 147.033 |
| 18.0 | 147.033 |
| 18.0 | 147.033 |
| 18.0 | 147.033 |
| 18.0 | 147.033 |
| 18.0 | 147.033 |
| 18.0 | 147.033 |
| 18.0 | 147.033 |
| 18.0 | 147.033 |
| 18.0 | 147.033 |
| 18.0 | 147.033 |
| 18.0 | 147.033 |
| 18.0 | 147.033 |
| 18.0 | 147.033 |
| 18.0 | 147.033 |
| 18.0 | 147.033 |
| 18.0 | 147.033 |
| 18.0 | 147.033 |
| 18.0 | 147.033 |
| 18.0 | 147.033 |
| 18.0 | 147.033 |
| 18.0 | 147.033 |
| 18.0 | 147.033 |
| 18.0 | 147.033 |
| 18.0 | 147.033 |
| 18.0 | 147.033 |
| 18.0 | 147.033 |
| 18.0 | 147.033 |
| 18.0 | 147.033 |
| 18.0 | 147.033 |
| 18.0 | 147.033 |
| 18.0 | 147.033 |
| 18.0 | 147.033 |
| 18.0 | 147.033 |
| 18.0 | 147.033 |
| 18.0 | 147.033 |
| 18.0 | 147.033 |
| 18.0 | 147.033 |
| 18.0 | 147.033 |
| 18.0 | 147.033 |
| 18.0 | 147.033 |
| 18.0 | 147.033 |
| 18.0 | 147.033 |
| 18.0 | 147.033 |
| 18.0 | 147.033 |
| 18.0 | 147.033 |
| 18.0 | 147.033 |
| 18.0 | 147.033 |
| 18.0 | 147.033 |
| 18.0 | 147.033 |
| 18.0 | 147.033 |
| 18.0 | 147.033 |
| 18.0 | 147.033 |
| 18.0 | 147.033 |
| 18.0 | 147.033 |
| 18.0 | 147.033 |
| 18.0 | 147.033 |
| 18.0 | 147.033 |
| 18.0 | 147.033 |
| 18.0 | 147.033 |
| 18.0 | 147.033 |
| 18.0 | 147.033 |
| 18.0 | 147.033 |
| 18.0 | 147.033 |
| 18.0 | 147.033 |
| 18.0 | 147.033 |
| 18.0 | 147.033 |
| 18.0 | 147.033 |
| 18.0 | 147.033 |
| 18.0 | 147.033 |
| 18.0 | 147.033 |
| 18.0 | 147.033 |
| 18.0 | 147.033 |
| 18.0 | 147.033 |
| 18.0 | 147.033 |
| 18.0 | 147.033 |
| 18.0 | 147.033 |
| 18.0 | 147.033 |
| 18.0 | 147.033 |
| 18.0 | 147.033 |
| 18.0 | 147.033 |
| 18.0 | 147.033 |
| 18.0 | 147.033 |
| 18.0 | 147.033 |
| 18.0 | 147.033 |
| 18.0 | 147.033 |
| 18.0 | 147.033 |
| 18.0 | 147.033 |
| 18.0 | 147.033 |
| 18.0 | 147.033 |
| 18.0 | 147.033 |
| 18.0 | 147.033 |
| 18.0 | 147.033 |
| 18.0 | 147.033 |
| 18.0 | 147.033 |
| 18.0 | 147.033 |
| 18.0 | 147.033 |
| 18.0 | 147.033 |
| 18.0 | 147.033 |
| 18.0 | 147.033 |
| 18.0 | 147.033 |
| 18.0 | 147.033 |
| 18.0 | 147.033 |
| 18.0 | 147.033 |
| 18.0 | 147.033 |
| 18.0 | 147.033 |
| 18.0 | 147.033 |
| 18.0 | 147.033 |
| 18.0 | 147.033 |
| 18.0 | 147.033 |
| 18.0 | 147.033 |
| 18.0 | 147.033 |
| 18.0 | 147.033 |
| 18.0 | 147.033 |
| 18.0 | 147.033 |
| 18.0 | 147.033 |
| 18.0 | 147.033 |
| 18.0 | 147.033 |
| 18.0 | 147.033 |
| 18.0 | 147.033 |
| 18.0 | 147.033 |
| 18.0 | 147.033 |
| 18.0 | 147.033 |
| 18.0 | 147.033 |
| 18.0 | 147.033 |
| 18.0 | 147.033 |
| 18.0 | 147.033 |
| 18.0 | 147.033 |
| 18.0 | 147.033 |
| 18.0 | 147.033 |
| 18.0 | 147.033 |
| 18.0 | 147.033 |
| 18.0 | 147.033 |
| 18.0 | 147.033 |
| 18.0 | 147.033 |
| 18.0 | 147.033 |
| 18.0 | 147.033 |
| 18.0 | 147.033 |
| 18.0 | 147.033 |
| 18.0 | 147.033 |
| 18.0 | 147.033 |
| 18.0 | 147.033 |
| 18.0 | 147.033 |
| 18.0 | 147.033 |
| 18.0 | 147.033 |
| 18.0 | 147.033 |
| 18.0 | 147.033 |
| 18.0 | 147.033 |
| 18.0 | 147.033 |
| 18.0 | 147.033 |
| 18.0 | 147.033 |
| 18.0 | 147.033 |
| 18.0 | 147.033 |
| 18.0 | 147.033 |
| 18.0 | 147.033 |
| 18.0 | 147.033 |
| 18.0 | 147.033 |
| 18.0 | 147.033 |
| 18.0 | 147.033 |
| 18.0 | 147.033 |
| 18.0 | 147.033 |
| 18.0 | 147.033 |
| 18.0 | 147.033 |
| 18.0 | 147.033 |
| 18.0 | 147.033 |
| 18.0 | 147.033 |
| 18.0 | 147.033 |
| 18.0 | 147.033 |
| 18.0 | 147.033 |
| 18.0 | 147.033 |
| 18.0 | 147.033 |
| 18.0 | 147.033 |
| 18.0 | 147.033 |
| 18.0 | 147.033 |
| 18.0 | 147.033 |
| 18.0 | 147.033 |
| 18.0 | 147.033 |
| 18.0 | 147.033 |
| 18.0 | 147.033 |
| 18.0 | 147.033 |
| 18.0 | 147.033 |
| 18.0 | 147.033 |
| 18.0 | 147.033 |
| 18.0 | 147.033 |
| 18.0 | 147.033 |
| 18.0 | 147.033 |
| 18.0 | 147.033 |
| 18.0 | 147.033 |
| 18.0 | 147.033 |
| 18.0 | 147.033 |
| 18.0 | 147.033 |
| 18.0 | 147.033 |
| 18.0 | 147.033 |
| 18.0 | 147.033 |
| 18.0 | 147.033 |
| 18.0 | 147.033 |
| 18.0 | 147.033 |
| 18.0 | 147.033 |
| 18.0 | 147.033 |
| 18.0 | 147.033 |
| 18.0 | 147.033 |
| 18.0 | 147.033 |
| 18.0 | 147.033 |
| 18.0 | 147.033 |
| 18.0 | 147.033 |
| 18.0 | 147.033 |
| 18.0 | 147.033 |
| 18.0 | 147.033 |
| 18.0 | 147.033 |
| 18.0 | 147.033 |
| 18.0 | 147.033 |
| 18.0 | 147.033 |
| 18.0 | 147.033 |
| 18.0 | 147.033 |
| 18.0 | 147.033 |
| 18.0 | 147.033 |
| 18.0 | 147.033 |
| 18.0 | 147.033 |
| 18.0 | 147.033 |
| 18.0 | 147.033 |
| 18.0 | 147.033 |
| 18.0 | 147.033 |
| 18.0 | 147.033 |
| 18.0 | 147.033 |
| 18.0 | 147.033 |
| 18.0 | 147.033 |
| 18.0 | 147.033 |
| 18.0 | 147.033 |
| 18.0 | 147.033 |
| 18.0 | 147.033 |
| 18.0 | 147.033 |
| 18.0 | 147.033 |
| 18.0 | 147.033 |
| 18.0 | 147.033 |
| 18.0 | 147.033 |
| 18.0 | 147.033 |
| 18.0 | 147.033 |
| 18.0 | 147.033 |
| 18.0 | 147.033 |
| 18.0 | 147.033 |
| 18.0 | 147.033 |
| 18.0 | 147.033 |
| 18.0 | 147.033 |
| 18.0 | 147.033 |
| 18.0 | 147.033 |
| 18.0 | 147.033 |
| 18.0 | 147.033 |
| 18.0 | 147.033 |
| 18.0 | 147.033 |
| 18.0 | 147.033 |
| 18.0 | 147.033 |
| 18.0 | 147.033 |
| 18.0 | 147.033 |
| 18.0 | 147.033 |
| 18.0 | 147.033 |
| 18.0 | 147.033 |
| 18.0 | 147.033 |
| 18.0 | 147.033 |
| 18.0 | 147.033 |
| 18.0 | 147.033 |
| 18.0 | 147.033 |
| 18.0 | 147.033 |
| 18.0 | 147.033 |
| 18.0 | 147.033 |
| 18.0 | 147.033 |
| 18.0 | 147.033 |
| 18.0 | 147.033 |
| 18.0 | 147.033 |
| 18.0 | 147.033 |
| 18.0 | 147.033 |
| 18.0 | 147.033 |
| 18.0 | 147.033 |
| 18.0 | 147.033 |
| 18.0 | 147.033 |
| 18.0 | 147.033 |
| 18.0 | 147.033 |
| 18.0 | 147.033 |
| 18.0 | 147.033 |
| 18.0 | 147.033 |
| 18.0 | 147.033 |
| 18.0 | 147.033 |
| 18.0 | 147.033 |
| 18.0 | 147.033 |
| 18.0 | 147.033 |
| 18.0 | 147.033 |
| 18.0 | 147.033 |
| 18.0 | 147.033 |
| 18.0 | 147.033 |
| 18.0 | 147.033 |
| 18.0 | 147.033 |
| 18.0 | 147.033 |
| 18.0 | 147.033 |
| 18.0 | 147.033 |
| 18.0 | 147.033 |
| 18.0 | 147.033 |
| 18.0 | 147.033 |
| 18.0 | 147.033 |
| 18.0 | 147.033 |
| 18.0 | 147.033 |
| 18.0 | 147.033 |
| 18.0 | 147.033 |
| 18.0 | 147.033 |
| 18.0 | 147.033 |
| 18.0 | 147.033 |
| 18.0 | 147.033 |
| 18.0 | 147.033 |
| 18.0 | 147.033 |
| 18.0 | 147.033 |
| 18.0 | 147.033 |
| 18.0 | 147.033 |
| 18.0 | 147.033 |
| 18.0 | 147.033 |
| 18.0 | 147.033 |
| 18.0 | 147.033 |
| 18.0 | 147.033 |
| 18.0 | 147.033 |
| 18.0 | 147.033 |
| 18.0 | 147.033 |
| 18.0 | 147.033 |
| 18.0 | 147.033 |
| 18.0 | 147.033 |
| 18.0 | 147.033 |
| 18.0 | 147.033 |
| 18.0 | 147.033 |
| 18.0 | 147.033 |
| 18.0 | 147.033 |
| 18.0 | 147.033 |
| 18.0 | 147.033 |
| 18.0 | 147.033 |
| 18.0 | 147.033 |
| 18.0 | 147.033 |
| 18.0 | 147.033 |
| 18.0 | 147.033 |
| 18.0 | 147.033 |
| 18.0 | 147.033 |
| 18.0 | 147.033 |
| 18.0 | 147.033 |
| 18.0 | 147.033 |
| 18.0 | 147.033 |
| 18.0 | 147.033 |
| 18.0 | 147.033 |
| 18.0 | 147.033 |
| 18.0 | 147.033 |
| 18.0 | 147.033 |
| 18.0 | 147.033 |
| 18.0 | 147.033 |
| 18.0 | 147.033 |
| 18.0 | 147.033 |
| 18.0 | 147.033 |
| 18.0 | 147.033 |
| 18.0 | 147.033 |
| 18.0 | 147.033 |
| 18.0 | 147.033 |
| 18.0 | 147.033 |
| 18.0 | 147.033 |
| 18.0 | 147.033 |
| 18.0 | 147.033 |
| 18.0 | 147.033 |
| 18.0 | 147.033 |
| 18.0 | 147.033 |
| 18.0 | 147.033 |
| 18.0 | 147.033 |
| 18.0 | 147.033 |
| 18.0 | 147.033 |
| 18.0 | 147.033 |
| 18.0 | 147.033 |
| 18.0 | 147.033 |
| 18.0 | 147.033 |
| 18.0 | 147.033 |
| 18.0 | 147.033 |
| 18.0 | 147.033 |
| 18.0 | 147.033 |
| 18.0 | 147.033 |
| 18.0 | 147.033 |
| 18.0 | 147.033 |
| 18.0 | 147.033 |
| 18.0 | 147.033 |
| 18.0 | 147.033 |
| 18.0 | 147.033 |
| 18.0 | 147.033 |
| 18.0 | 147.033 |
| 18.0 | 147.033 |
| 18.0 | 147.033 |
| 18.0 | 147.033 |
| 18.0 | 147.033 |
| 18.0 | 147.033 |
| 18.0 | 147.033 |
| 18.0 | 147.033 |
| 18.0 | 147.033 |
| 18.0 | 147.033 |
| 18.0 | 147.033 |
| 18.0 | 147.033 |
| 18.0 | 147.033 |
| 18.0 | 147.033 |
| 18.0 | 147.033 |
| 18.0 | 147.033 |
| 18.0 | 147.033 |
| 18.0 | 147.033 |
| 18.0 | 147.033 |
| 18.0 | 147.033 |
| 18.0 | 147.033 |
| 18.0 | 147.033 |
| 18.0 | 147.033 |
| 18.0 | 147.033 |
| 18.0 | 147.033 |
| 18.0 | 147.033 |
| 18.0 | 147.033 |
| 18.0 | 147.033 |
| 18.0 | 147.033 |
| 18.0 | 147.033 |
| 18.0 | 147.033 |
| 18.0 | 147.033 |
| 18.0 | 147.033 |
| 18.0 | 147.033 |
| 18.0 | 147.033 |
| 18.0 | 147.033 |
| 18.0 | 147.033 |
| 18.0 | 147.033 |
| 18.0 | 147.033 |
| 18.0 | 147.033 |
| 18.0 | 147.033 |
| 18.0 | 147.033 |
| 18.0 | 147.033 |
| 18.0 | 147.033 |
| 18.0 | 147.033 |
| 18.0 | 147.033 |
| 18.0 | 147.033 |
| 18.0 | 147.033 |
| 18.0 | 147.033 |
| 18.0 | 147.033 |
| 18.0 | 147.033 |
| 18.0 | 147.033 |
| 18.0 | 147.033 |
| 18.0 | 147.033 |
| 18.0 | 147.033 |
| 18.0 | 147.033 |
| 18.0 | 147.033 |
| 18.0 | 147.033 |
| 18.0 | 147.033 |
| 18.0 | 147.033 |
| 18.0 | 147.033 |
| 18.0 | 147.033 |
| 18.0 | 147.033 |
| 18.0 | 147.033 |
| 18.0 | 147.033 |
| 18.0 | 147.033 |
| 18.0 | 147.033 |
| 18.0 | 147.033 |
| 18.0 | 147.033 |
| 18.0 | 147.033 |
| 18.0 | 147.033 |
| 18.0 | 147.033 |
| 18.0 | 147.033 |
| 18.0 | 147.033 |
| 18.0 | 147.033 |
| 18.0 | 147.033 |
| 18.0 | 147.033 |
| 18.0 | 147.033 |
| 18.0 | 147.033 |
| 18.0 | 147.033 |
| 18.0 | 147.033 |
| 18.0 | 147.033 |
| 18.0 | 147.033 |
| 18.0 | 147.033 |
| 18.0 | 147.033 |
| 18.0 | 147.033 |
| 18.0 | 147.033 |
| 18.0 | 147.033 |
| 18.0 | 147.033 |
| 18.0 | 147.033 |
| 18.0 | 147.033 |
| 18.0 | 147.033 |
| 18.0 | 147.033 |
| 18.0 | 147.033 |
| 18.0 | 147.033 |
| 18.0 | 147.033 |
| 18.0 | 147.033 |
| 18.0 | 147.033 |
| 18.0 | 147.033 |
| 18.0 | 147.033 |
| 18.0 | 147.033 |
| 18.0 | 147.033 |
| 18.0 | 147.033 |
| 18.0 | 147.033 |
| 18.0 | 147.033 |
| 18.0 | 147.033 |
| 18.0 | 147.033 |
| 18.0 | 147.033 |
| 18.0 | 147.033 |
| 18.0 | 147.033 |
| 18.0 | 147.033 |
| 18.0 | 147.033 |
| 18.0 | 147.033 |
| 18.0 | 147.033 |
| 18.0 | 147.033 |
| 18.0 | 147.033 |
| 18.0 | 147.033 |
| 18.0 | 147.033 |
| 18.0 | 147.033 |
| 18.0 | 147.033 |
| 18.0 | 147.033 |
| 18.0 | 147.033 |
| 18.0 | 147.033 |
| 18.0 | 147.033 |
| 18.0 | 147.033 |
| 18.0 | 147.033 |
| 18.0 | 147.033 |
| 18.0 | 147.033 |
| 18.0 | 147.033 |
| 18.0 | 147.033 |